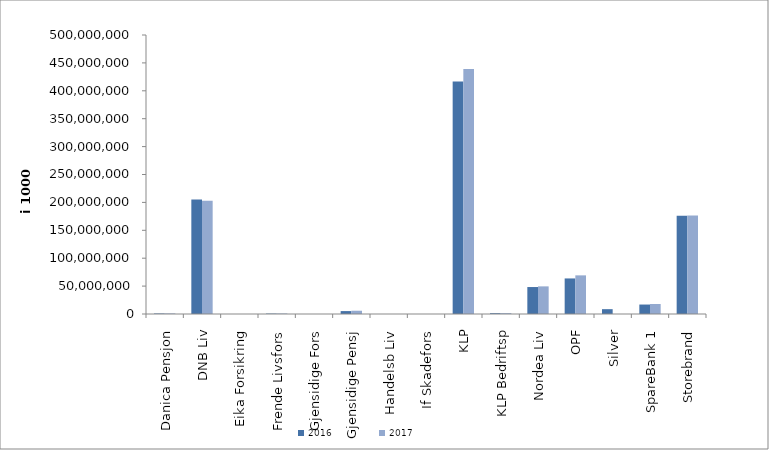
| Category | 2016 | 2017 |
|---|---|---|
| 0 | 921554.284 | 1007145.416 |
| 1 | 205209654 | 202963024 |
| 2 | 0 | 0 |
| 3 | 738160 | 882143 |
| 4 | 0 | 0 |
| 5 | 5218584.771 | 5849818.078 |
| 6 | 23804 | 24751 |
| 7 | 0 | 0 |
| 8 | 416576263.684 | 439040297.388 |
| 9 | 1465104 | 1539670 |
| 10 | 48325800.01 | 49512507.852 |
| 11 | 63722413 | 69246198 |
| 12 | 8663691.537 | 0 |
| 13 | 16959011.262 | 17948766.885 |
| 14 | 175999064.085 | 176373831.6 |